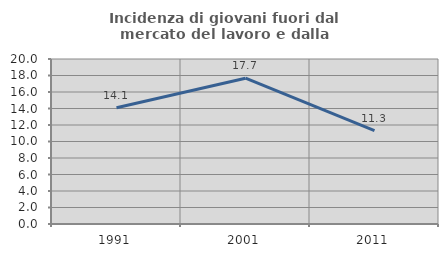
| Category | Incidenza di giovani fuori dal mercato del lavoro e dalla formazione  |
|---|---|
| 1991.0 | 14.086 |
| 2001.0 | 17.672 |
| 2011.0 | 11.309 |